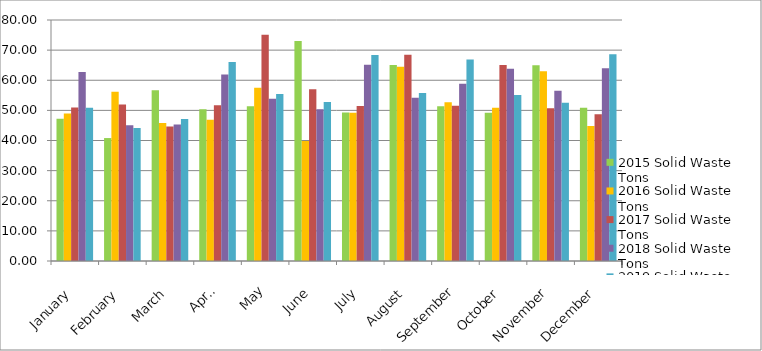
| Category | 2015 Solid Waste Tons | 2016 Solid Waste Tons | 2017 Solid Waste Tons | 2018 Solid Waste Tons | 2019 Solid Waste Tons |
|---|---|---|---|---|---|
| January | 47.26 | 48.97 | 50.98 | 62.73 | 50.86 |
| February | 40.81 | 56.2 | 51.94 | 45.03 | 44.19 |
| March | 56.68 | 45.78 | 44.66 | 45.29 | 47.13 |
| April | 50.35 | 46.86 | 51.7 | 61.9 | 66.08 |
| May | 51.39 | 57.55 | 75.07 | 53.88 | 55.4 |
| June | 73.02 | 39.83 | 56.98 | 50.37 | 52.8 |
| July | 49.31 | 49.18 | 51.45 | 65.18 | 68.37 |
| August | 65.09 | 64.47 | 68.45 | 54.19 | 55.73 |
| September | 51.33 | 52.72 | 51.5 | 58.85 | 66.86 |
| October | 49.24 | 50.87 | 65.06 | 63.78 | 55.13 |
| November | 64.96 | 62.95 | 50.7 | 56.52 | 52.56 |
| December | 50.87 | 44.82 | 48.72 | 64 | 68.61 |